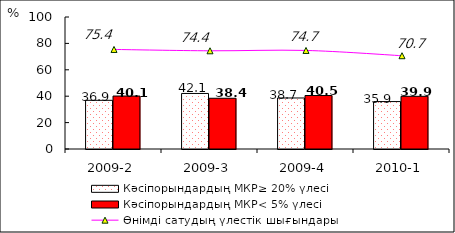
| Category | Кәсіпорындардың МКР≥ 20% үлесі | Кәсіпорындардың МКР< 5% үлесі |
|---|---|---|
| 2009-2 | 36.873 | 40.117 |
| 2009-3 | 42.075 | 38.426 |
| 2009-4 | 38.657 | 40.509 |
| 2010-1 | 35.938 | 39.911 |